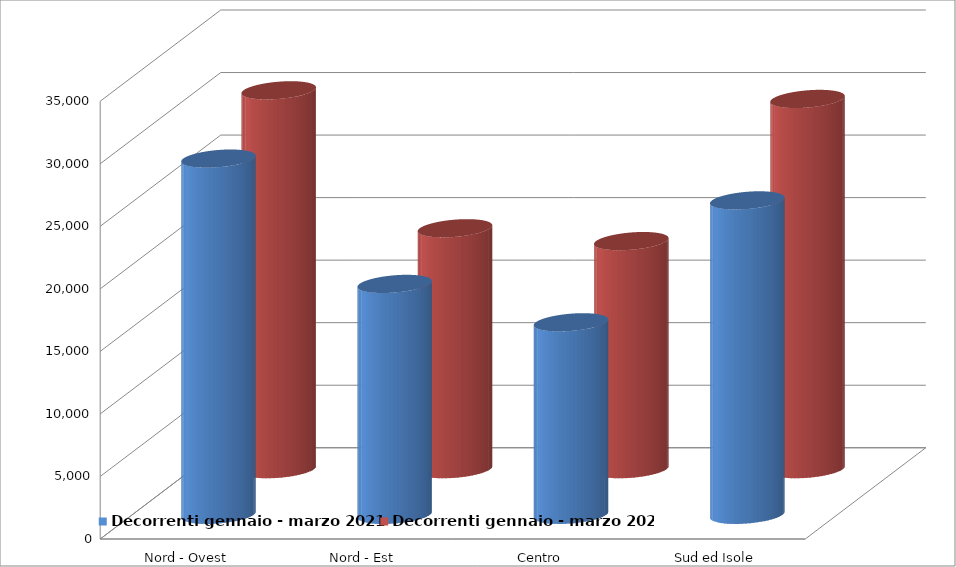
| Category | Decorrenti gennaio - marzo 2021 | Decorrenti gennaio - marzo 2020 |
|---|---|---|
| Nord - Ovest | 28480 | 30292 |
| Nord - Est | 18461 | 19263 |
| Centro | 15392 | 18237 |
| Sud ed Isole | 25139 | 29602 |